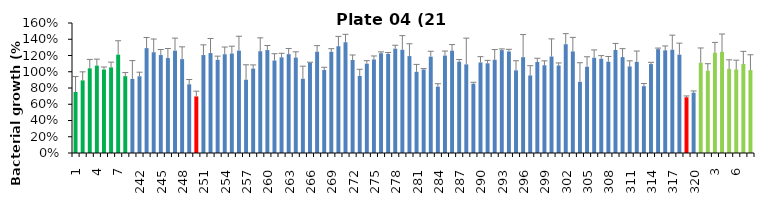
| Category | 21 h % |
|---|---|
| 1.0 | 0.751 |
| 2.0 | 0.894 |
| 3.0 | 1.042 |
| 4.0 | 1.076 |
| 5.0 | 1.028 |
| 6.0 | 1.054 |
| 7.0 | 1.21 |
| 8.0 | 0.946 |
| 241.0 | 0.912 |
| 242.0 | 0.944 |
| 243.0 | 1.291 |
| 244.0 | 1.24 |
| 245.0 | 1.206 |
| 246.0 | 1.169 |
| 247.0 | 1.259 |
| 248.0 | 1.156 |
| 249.0 | 0.845 |
| 250.0 | 0.696 |
| 251.0 | 1.206 |
| 252.0 | 1.23 |
| 253.0 | 1.146 |
| 254.0 | 1.215 |
| 255.0 | 1.225 |
| 256.0 | 1.26 |
| 257.0 | 0.901 |
| 258.0 | 1.039 |
| 259.0 | 1.252 |
| 260.0 | 1.267 |
| 261.0 | 1.138 |
| 262.0 | 1.177 |
| 263.0 | 1.216 |
| 264.0 | 1.175 |
| 265.0 | 0.913 |
| 266.0 | 1.11 |
| 267.0 | 1.246 |
| 268.0 | 1.021 |
| 269.0 | 1.245 |
| 270.0 | 1.314 |
| 271.0 | 1.363 |
| 272.0 | 1.145 |
| 273.0 | 0.948 |
| 274.0 | 1.099 |
| 275.0 | 1.151 |
| 276.0 | 1.228 |
| 277.0 | 1.219 |
| 278.0 | 1.284 |
| 279.0 | 1.27 |
| 280.0 | 1.193 |
| 281.0 | 0.999 |
| 282.0 | 1.027 |
| 283.0 | 1.186 |
| 284.0 | 0.816 |
| 285.0 | 1.199 |
| 286.0 | 1.259 |
| 287.0 | 1.123 |
| 288.0 | 1.091 |
| 289.0 | 0.852 |
| 290.0 | 1.114 |
| 291.0 | 1.104 |
| 292.0 | 1.147 |
| 293.0 | 1.267 |
| 294.0 | 1.25 |
| 295.0 | 1.017 |
| 296.0 | 1.179 |
| 297.0 | 0.954 |
| 298.0 | 1.12 |
| 299.0 | 1.08 |
| 300.0 | 1.187 |
| 301.0 | 1.078 |
| 302.0 | 1.339 |
| 303.0 | 1.25 |
| 304.0 | 0.875 |
| 305.0 | 1.061 |
| 306.0 | 1.172 |
| 307.0 | 1.159 |
| 308.0 | 1.123 |
| 309.0 | 1.268 |
| 310.0 | 1.181 |
| 311.0 | 1.065 |
| 312.0 | 1.122 |
| 313.0 | 0.823 |
| 314.0 | 1.095 |
| 315.0 | 1.278 |
| 316.0 | 1.264 |
| 317.0 | 1.271 |
| 318.0 | 1.21 |
| 319.0 | 0.686 |
| 320.0 | 0.743 |
| 1.0 | 1.11 |
| 2.0 | 1.012 |
| 3.0 | 1.234 |
| 4.0 | 1.246 |
| 5.0 | 1.035 |
| 6.0 | 1.028 |
| 7.0 | 1.095 |
| 8.0 | 1.02 |